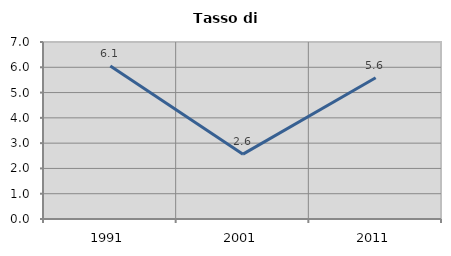
| Category | Tasso di disoccupazione   |
|---|---|
| 1991.0 | 6.052 |
| 2001.0 | 2.564 |
| 2011.0 | 5.587 |